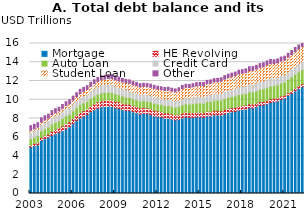
| Category | Mortgage | HE Revolving | Auto Loan | Credit Card | Student Loan | Other |
|---|---|---|---|---|---|---|
| 2003-03-31 | 4.942 | 0.242 | 0.641 | 0.688 | 0.241 | 0.478 |
| 2003-06-30 | 5.08 | 0.26 | 0.622 | 0.693 | 0.243 | 0.486 |
| 2003-09-30 | 5.183 | 0.269 | 0.684 | 0.693 | 0.249 | 0.477 |
| 2003-12-31 | 5.66 | 0.302 | 0.704 | 0.698 | 0.253 | 0.449 |
| 2004-03-31 | 5.84 | 0.328 | 0.72 | 0.695 | 0.26 | 0.446 |
| 2004-06-30 | 5.967 | 0.367 | 0.743 | 0.697 | 0.263 | 0.423 |
| 2004-09-30 | 6.21 | 0.426 | 0.751 | 0.706 | 0.33 | 0.41 |
| 2004-12-31 | 6.36 | 0.468 | 0.728 | 0.717 | 0.346 | 0.423 |
| 2005-03-31 | 6.512 | 0.502 | 0.725 | 0.71 | 0.364 | 0.394 |
| 2005-06-30 | 6.696 | 0.528 | 0.774 | 0.717 | 0.374 | 0.402 |
| 2005-09-30 | 6.906 | 0.541 | 0.83 | 0.732 | 0.378 | 0.405 |
| 2005-12-31 | 7.102 | 0.565 | 0.792 | 0.736 | 0.392 | 0.416 |
| 2006-03-31 | 7.436 | 0.582 | 0.788 | 0.723 | 0.434 | 0.418 |
| 2006-06-30 | 7.76 | 0.59 | 0.796 | 0.739 | 0.439 | 0.423 |
| 2006-09-30 | 8.045 | 0.603 | 0.821 | 0.754 | 0.447 | 0.442 |
| 2006-12-31 | 8.234 | 0.604 | 0.821 | 0.767 | 0.482 | 0.406 |
| 2007-03-31 | 8.422 | 0.605 | 0.794 | 0.764 | 0.506 | 0.404 |
| 2007-06-30 | 8.706 | 0.619 | 0.807 | 0.796 | 0.514 | 0.408 |
| 2007-09-30 | 8.925 | 0.631 | 0.818 | 0.817 | 0.529 | 0.413 |
| 2007-12-31 | 9.101 | 0.647 | 0.815 | 0.839 | 0.548 | 0.422 |
| 2008-03-31 | 9.234 | 0.663 | 0.808 | 0.837 | 0.579 | 0.415 |
| 2008-06-30 | 9.273 | 0.679 | 0.81 | 0.85 | 0.586 | 0.401 |
| 2008-09-30 | 9.294 | 0.692 | 0.809 | 0.858 | 0.611 | 0.412 |
| 2008-12-31 | 9.257 | 0.705 | 0.791 | 0.866 | 0.639 | 0.412 |
| 2009-03-31 | 9.135 | 0.714 | 0.766 | 0.843 | 0.663 | 0.409 |
| 2009-06-30 | 9.063 | 0.713 | 0.743 | 0.824 | 0.675 | 0.389 |
| 2009-09-30 | 8.944 | 0.708 | 0.739 | 0.812 | 0.694 | 0.382 |
| 2009-12-31 | 8.843 | 0.706 | 0.722 | 0.795 | 0.721 | 0.378 |
| 2010-03-31 | 8.834 | 0.695 | 0.705 | 0.762 | 0.758 | 0.363 |
| 2010-06-30 | 8.703 | 0.683 | 0.702 | 0.744 | 0.762 | 0.349 |
| 2010-09-30 | 8.609 | 0.673 | 0.71 | 0.731 | 0.778 | 0.343 |
| 2010-12-31 | 8.452 | 0.668 | 0.711 | 0.73 | 0.812 | 0.341 |
| 2011-03-31 | 8.544 | 0.64 | 0.706 | 0.696 | 0.839 | 0.329 |
| 2011-06-30 | 8.516 | 0.624 | 0.713 | 0.694 | 0.851 | 0.33 |
| 2011-09-30 | 8.402 | 0.639 | 0.73 | 0.693 | 0.87 | 0.327 |
| 2011-12-31 | 8.268 | 0.627 | 0.734 | 0.704 | 0.874 | 0.33 |
| 2012-03-31 | 8.187 | 0.612 | 0.736 | 0.679 | 0.904 | 0.318 |
| 2012-06-30 | 8.147 | 0.589 | 0.75 | 0.672 | 0.914 | 0.312 |
| 2012-09-30 | 8.028 | 0.573 | 0.768 | 0.674 | 0.956 | 0.311 |
| 2012-12-31 | 8.033 | 0.563 | 0.783 | 0.679 | 0.966 | 0.317 |
| 2013-03-31 | 7.932 | 0.552 | 0.794 | 0.66 | 0.986 | 0.307 |
| 2013-06-30 | 7.841 | 0.54 | 0.814 | 0.668 | 0.994 | 0.296 |
| 2013-09-30 | 7.897 | 0.535 | 0.845 | 0.672 | 1.027 | 0.304 |
| 2013-12-31 | 8.049 | 0.529 | 0.863 | 0.683 | 1.08 | 0.317 |
| 2014-03-31 | 8.165 | 0.526 | 0.875 | 0.659 | 1.111 | 0.314 |
| 2014-06-30 | 8.096 | 0.521 | 0.905 | 0.669 | 1.118 | 0.323 |
| 2014-09-30 | 8.131 | 0.512 | 0.934 | 0.68 | 1.126 | 0.327 |
| 2014-12-31 | 8.17 | 0.51 | 0.955 | 0.7 | 1.157 | 0.335 |
| 2015-03-31 | 8.171 | 0.51 | 0.968 | 0.684 | 1.189 | 0.329 |
| 2015-06-30 | 8.116 | 0.499 | 1.006 | 0.703 | 1.19 | 0.339 |
| 2015-09-30 | 8.26 | 0.492 | 1.045 | 0.714 | 1.203 | 0.351 |
| 2015-12-31 | 8.249 | 0.487 | 1.064 | 0.733 | 1.232 | 0.351 |
| 2016-03-31 | 8.369 | 0.485 | 1.071 | 0.712 | 1.261 | 0.354 |
| 2016-06-30 | 8.362 | 0.478 | 1.103 | 0.729 | 1.259 | 0.356 |
| 2016-09-30 | 8.35 | 0.472 | 1.135 | 0.747 | 1.279 | 0.367 |
| 2016-12-31 | 8.48 | 0.473 | 1.157 | 0.779 | 1.31 | 0.377 |
| 2017-03-31 | 8.627 | 0.456 | 1.167 | 0.764 | 1.344 | 0.367 |
| 2017-06-30 | 8.691 | 0.452 | 1.19 | 0.784 | 1.344 | 0.378 |
| 2017-09-30 | 8.743 | 0.448 | 1.213 | 0.808 | 1.357 | 0.386 |
| 2017-12-31 | 8.882 | 0.444 | 1.221 | 0.834 | 1.378 | 0.389 |
| 2018-03-31 | 8.939 | 0.436 | 1.229 | 0.815 | 1.407 | 0.385 |
| 2018-06-30 | 8.999 | 0.432 | 1.238 | 0.829 | 1.405 | 0.39 |
| 2018-09-30 | 9.14 | 0.422 | 1.265 | 0.844 | 1.442 | 0.399 |
| 2018-12-31 | 9.124 | 0.412 | 1.274 | 0.87 | 1.457 | 0.407 |
| 2019-03-31 | 9.244 | 0.406 | 1.28 | 0.848 | 1.486 | 0.404 |
| 2019-06-30 | 9.406 | 0.399 | 1.297 | 0.868 | 1.478 | 0.412 |
| 2019-09-30 | 9.437 | 0.396 | 1.315 | 0.881 | 1.498 | 0.425 |
| 2019-12-31 | 9.557 | 0.39 | 1.331 | 0.927 | 1.508 | 0.432 |
| 2020-03-31 | 9.713 | 0.386 | 1.346 | 0.893 | 1.535 | 0.427 |
| 2020-06-30 | 9.776 | 0.375 | 1.343 | 0.817 | 1.537 | 0.418 |
| 2020-09-30 | 9.861 | 0.362 | 1.36 | 0.807 | 1.546 | 0.417 |
| 2020-12-31 | 10.043 | 0.349 | 1.374 | 0.819 | 1.555 | 0.419 |
| 2021-03-31 | 10.16 | 0.335 | 1.382 | 0.77 | 1.584 | 0.413 |
| 2021-06-30 | 10.442 | 0.322 | 1.415 | 0.787 | 1.57 | 0.421 |
| 2021-09-30 | 10.672 | 0.317 | 1.443 | 0.804 | 1.584 | 0.423 |
| 2021-12-31 | 10.93 | 0.318 | 1.458 | 0.856 | 1.576 | 0.438 |
| 2022-03-31 | 11.18 | 0.317 | 1.469 | 0.841 | 1.59 | 0.445 |
| 2022-06-30 | 11.387 | 0.319 | 1.502 | 0.887 | 1.589 | 0.47 |